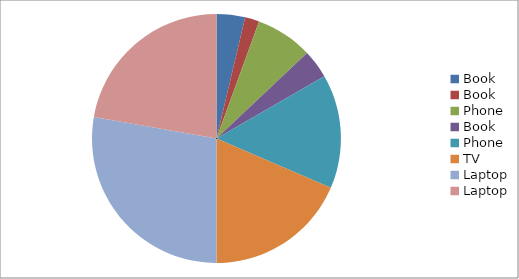
| Category | Series 0 | Series 1 | Series 2 | Series 3 | Series 4 |
|---|---|---|---|---|---|
| Book | 100 | 10 |  | 90 |  |
| Book | 50 | 5 |  | 45 |  |
| Phone | 200 | 40 |  | 160 |  |
| Book | 100 | 10 |  | 90 |  |
| Phone | 400 | 120 |  | 280 |  |
| TV | 500 | 150 |  | 350 |  |
| Laptop | 750 | 375 |  | 375 |  |
| Laptop | 600 | 240 |  | 360 |  |